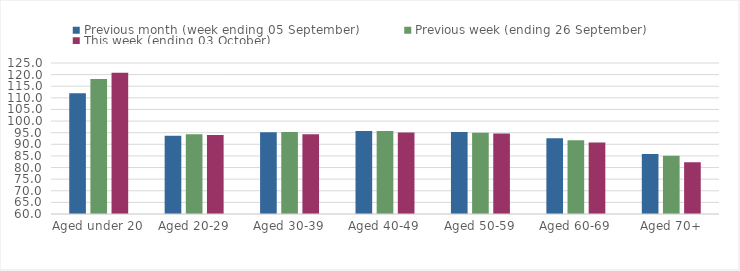
| Category | Previous month (week ending 05 September) | Previous week (ending 26 September) | This week (ending 03 October) |
|---|---|---|---|
| Aged under 20 | 111.97 | 118.07 | 120.85 |
| Aged 20-29 | 93.7 | 94.35 | 94.03 |
| Aged 30-39 | 95.19 | 95.27 | 94.33 |
| Aged 40-49 | 95.68 | 95.68 | 95.1 |
| Aged 50-59 | 95.3 | 94.97 | 94.64 |
| Aged 60-69 | 92.65 | 91.78 | 90.82 |
| Aged 70+ | 85.84 | 85.04 | 82.3 |